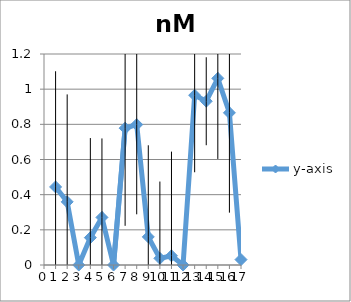
| Category | y-axis |
|---|---|
| 1.0 | 0.444 |
| 2.0 | 0.359 |
| 3.0 | 0 |
| 4.0 | 0.156 |
| 5.0 | 0.271 |
| 6.0 | 0 |
| 7.0 | 0.778 |
| 8.0 | 0.799 |
| 9.0 | 0.16 |
| 10.0 | 0.038 |
| 11.0 | 0.053 |
| 12.0 | 0 |
| 13.0 | 0.966 |
| 14.0 | 0.931 |
| 15.0 | 1.062 |
| 16.0 | 0.865 |
| 17.0 | 0.031 |